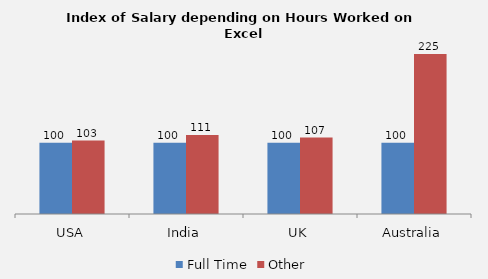
| Category | Full Time | Other |
|---|---|---|
| USA | 100 | 103.107 |
| India | 100 | 110.931 |
| UK | 100 | 107.336 |
| Australia | 100 | 224.615 |